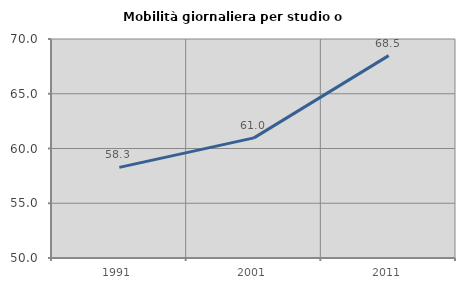
| Category | Mobilità giornaliera per studio o lavoro |
|---|---|
| 1991.0 | 58.275 |
| 2001.0 | 60.971 |
| 2011.0 | 68.482 |